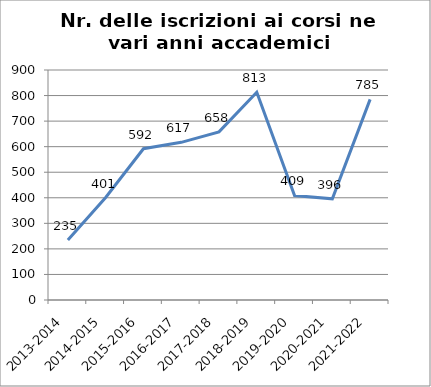
| Category | Nr. Iscrizioni ai Corsi |
|---|---|
| 2013-2014 | 235 |
| 2014-2015 | 401 |
| 2015-2016 | 592 |
| 2016-2017 | 617 |
| 2017-2018 | 658 |
| 2018-2019 | 813 |
| 2019-2020 | 409 |
| 2020-2021 | 396 |
| 2021-2022 | 785 |